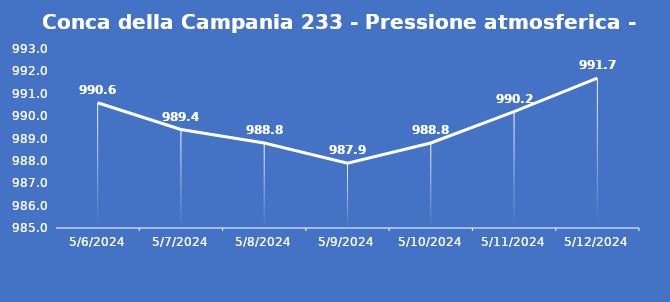
| Category | Conca della Campania 233 - Pressione atmosferica - Grezzo (hPa) |
|---|---|
| 5/6/24 | 990.6 |
| 5/7/24 | 989.4 |
| 5/8/24 | 988.8 |
| 5/9/24 | 987.9 |
| 5/10/24 | 988.8 |
| 5/11/24 | 990.2 |
| 5/12/24 | 991.7 |